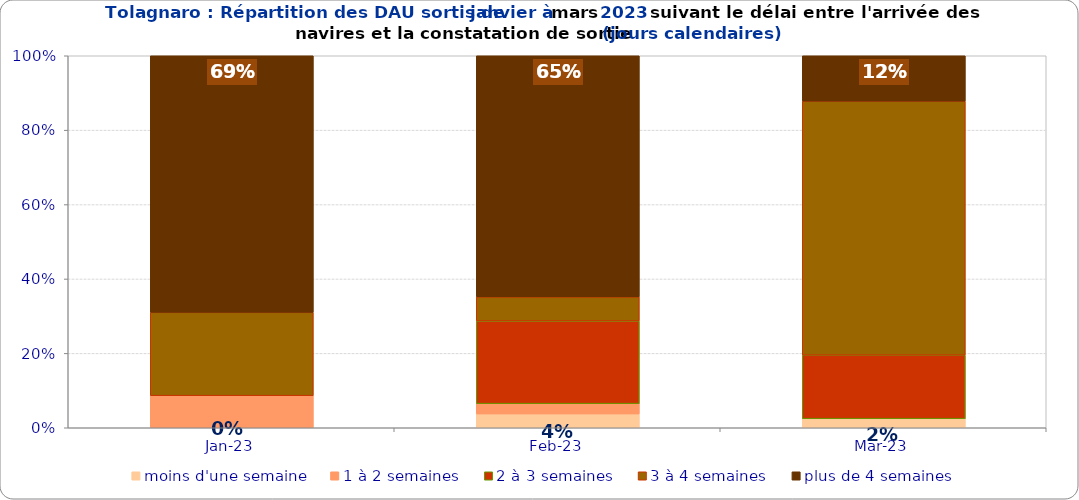
| Category | moins d'une semaine | 1 à 2 semaines | 2 à 3 semaines | 3 à 4 semaines | plus de 4 semaines |
|---|---|---|---|---|---|
| 2023-01-01 | 0 | 0.086 | 0 | 0.224 | 0.69 |
| 2023-02-01 | 0.037 | 0.028 | 0.222 | 0.065 | 0.648 |
| 2023-03-01 | 0.024 | 0 | 0.171 | 0.683 | 0.122 |